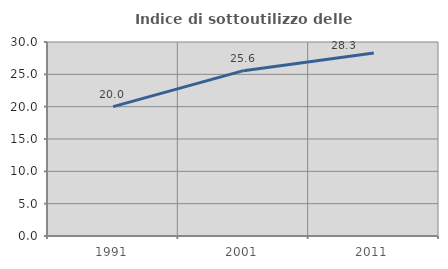
| Category | Indice di sottoutilizzo delle abitazioni  |
|---|---|
| 1991.0 | 20 |
| 2001.0 | 25.57 |
| 2011.0 | 28.302 |